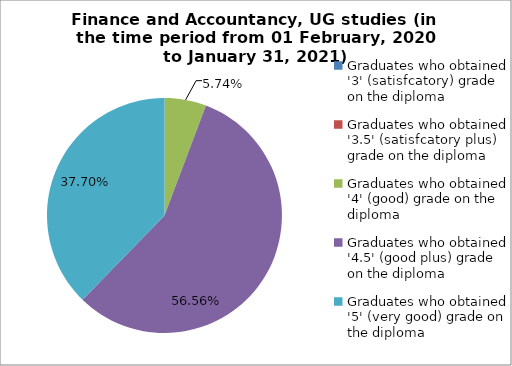
| Category | Series 0 |
|---|---|
| Graduates who obtained '3' (satisfcatory) grade on the diploma | 0 |
| Graduates who obtained '3.5' (satisfcatory plus) grade on the diploma | 0 |
| Graduates who obtained '4' (good) grade on the diploma | 5.738 |
| Graduates who obtained '4.5' (good plus) grade on the diploma | 56.557 |
| Graduates who obtained '5' (very good) grade on the diploma | 37.705 |